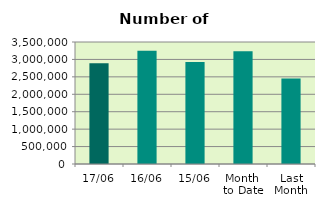
| Category | Series 0 |
|---|---|
| 17/06 | 2887610 |
| 16/06 | 3248856 |
| 15/06 | 2924300 |
| Month 
to Date | 3234513.077 |
| Last
Month | 2451339.2 |